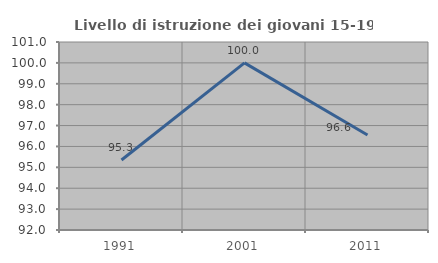
| Category | Livello di istruzione dei giovani 15-19 anni |
|---|---|
| 1991.0 | 95.349 |
| 2001.0 | 100 |
| 2011.0 | 96.552 |